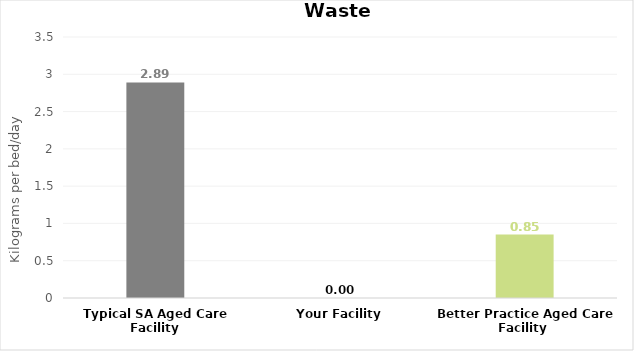
| Category | Series 0 |
|---|---|
| Typical SA Aged Care Facility | 2.89 |
| Your Facility | 0 |
| Better Practice Aged Care Facility  | 0.85 |